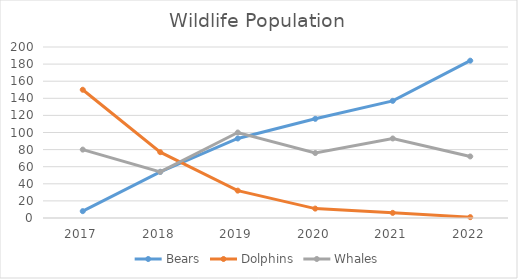
| Category | Bears | Dolphins | Whales |
|---|---|---|---|
| 2017.0 | 8 | 150 | 80 |
| 2018.0 | 54 | 77 | 54 |
| 2019.0 | 93 | 32 | 100 |
| 2020.0 | 116 | 11 | 76 |
| 2021.0 | 137 | 6 | 93 |
| 2022.0 | 184 | 1 | 72 |